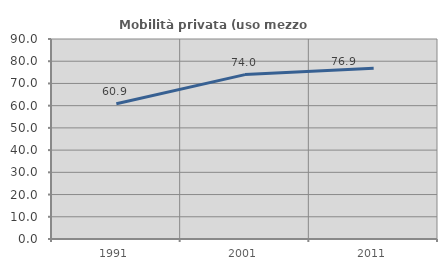
| Category | Mobilità privata (uso mezzo privato) |
|---|---|
| 1991.0 | 60.87 |
| 2001.0 | 73.984 |
| 2011.0 | 76.866 |